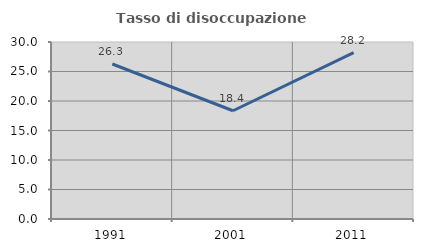
| Category | Tasso di disoccupazione giovanile  |
|---|---|
| 1991.0 | 26.273 |
| 2001.0 | 18.351 |
| 2011.0 | 28.185 |